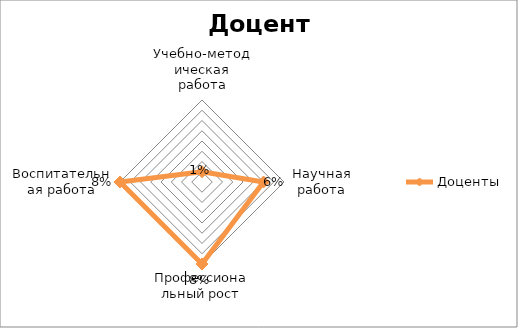
| Category | Доценты |
|---|---|
| Учебно-методическая работа | 0.01 |
| Научная работа | 0.06 |
| Профессиональный рост | 0.08 |
| Воспитательная работа | 0.08 |